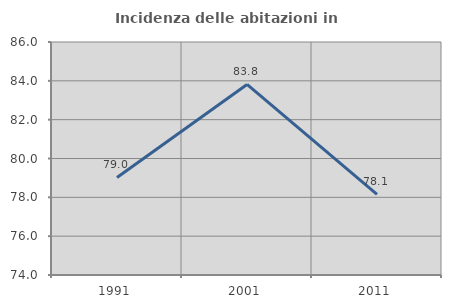
| Category | Incidenza delle abitazioni in proprietà  |
|---|---|
| 1991.0 | 79.024 |
| 2001.0 | 83.813 |
| 2011.0 | 78.147 |